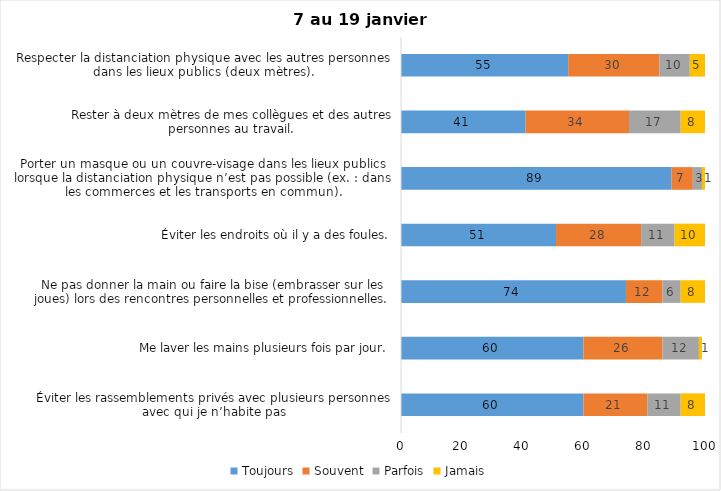
| Category | Toujours | Souvent | Parfois | Jamais |
|---|---|---|---|---|
| Éviter les rassemblements privés avec plusieurs personnes avec qui je n’habite pas | 60 | 21 | 11 | 8 |
| Me laver les mains plusieurs fois par jour. | 60 | 26 | 12 | 1 |
| Ne pas donner la main ou faire la bise (embrasser sur les joues) lors des rencontres personnelles et professionnelles. | 74 | 12 | 6 | 8 |
| Éviter les endroits où il y a des foules. | 51 | 28 | 11 | 10 |
| Porter un masque ou un couvre-visage dans les lieux publics lorsque la distanciation physique n’est pas possible (ex. : dans les commerces et les transports en commun). | 89 | 7 | 3 | 1 |
| Rester à deux mètres de mes collègues et des autres personnes au travail. | 41 | 34 | 17 | 8 |
| Respecter la distanciation physique avec les autres personnes dans les lieux publics (deux mètres). | 55 | 30 | 10 | 5 |